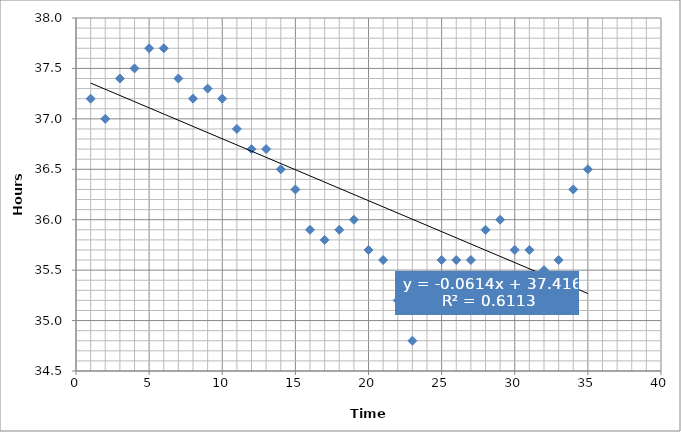
| Category | Hours |
|---|---|
| 1.0 | 37.2 |
| 2.0 | 37 |
| 3.0 | 37.4 |
| 4.0 | 37.5 |
| 5.0 | 37.7 |
| 6.0 | 37.7 |
| 7.0 | 37.4 |
| 8.0 | 37.2 |
| 9.0 | 37.3 |
| 10.0 | 37.2 |
| 11.0 | 36.9 |
| 12.0 | 36.7 |
| 13.0 | 36.7 |
| 14.0 | 36.5 |
| 15.0 | 36.3 |
| 16.0 | 35.9 |
| 17.0 | 35.8 |
| 18.0 | 35.9 |
| 19.0 | 36 |
| 20.0 | 35.7 |
| 21.0 | 35.6 |
| 22.0 | 35.2 |
| 23.0 | 34.8 |
| 24.0 | 35.3 |
| 25.0 | 35.6 |
| 26.0 | 35.6 |
| 27.0 | 35.6 |
| 28.0 | 35.9 |
| 29.0 | 36 |
| 30.0 | 35.7 |
| 31.0 | 35.7 |
| 32.0 | 35.5 |
| 33.0 | 35.6 |
| 34.0 | 36.3 |
| 35.0 | 36.5 |